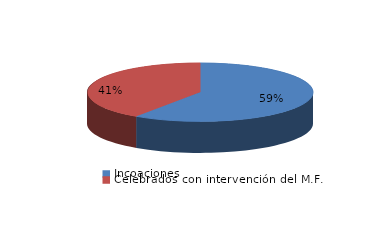
| Category | Series 0 |
|---|---|
| Incoaciones | 401 |
| Celebrados con intervención del M.F. | 273 |